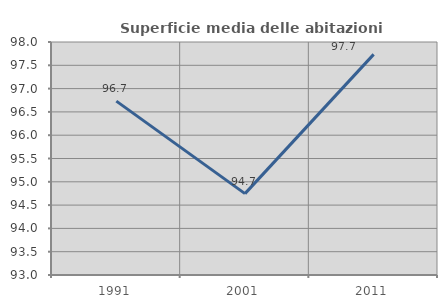
| Category | Superficie media delle abitazioni occupate |
|---|---|
| 1991.0 | 96.731 |
| 2001.0 | 94.746 |
| 2011.0 | 97.734 |